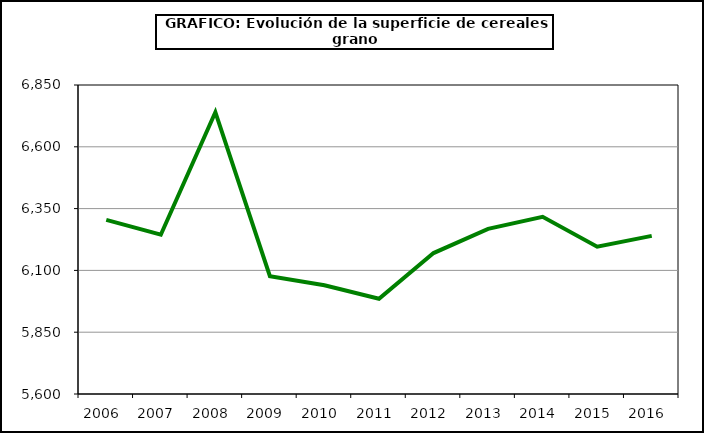
| Category | Superficie |
|---|---|
| 2006.0 | 6304.551 |
| 2007.0 | 6244.292 |
| 2008.0 | 6740.071 |
| 2009.0 | 6076.74 |
| 2010.0 | 6039.789 |
| 2011.0 | 5985.492 |
| 2012.0 | 6170.107 |
| 2013.0 | 6268.026 |
| 2014.0 | 6316.794 |
| 2015.0 | 6195.859 |
| 2016.0 | 6239.8 |